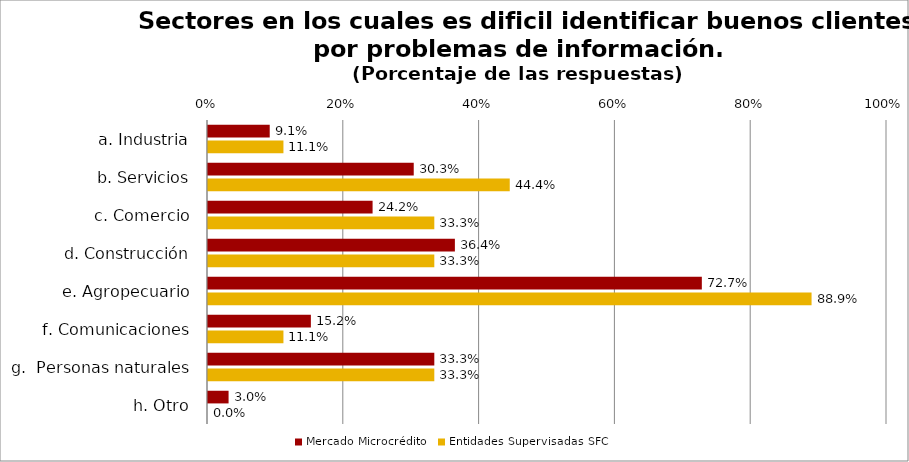
| Category | Mercado Microcrédito | Entidades Supervisadas SFC |
|---|---|---|
| a. Industria | 0.091 | 0.111 |
| b. Servicios | 0.303 | 0.444 |
| c. Comercio | 0.242 | 0.333 |
| d. Construcción | 0.364 | 0.333 |
| e. Agropecuario | 0.727 | 0.889 |
| f. Comunicaciones | 0.152 | 0.111 |
| g.  Personas naturales | 0.333 | 0.333 |
| h. Otro | 0.03 | 0 |